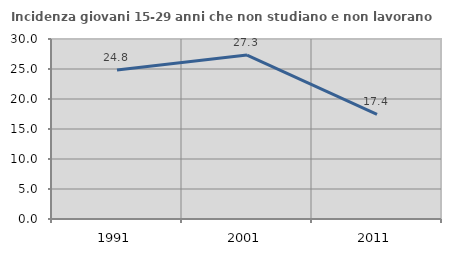
| Category | Incidenza giovani 15-29 anni che non studiano e non lavorano  |
|---|---|
| 1991.0 | 24.85 |
| 2001.0 | 27.317 |
| 2011.0 | 17.442 |